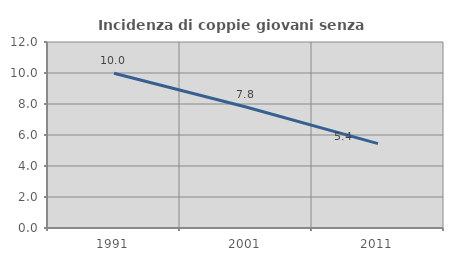
| Category | Incidenza di coppie giovani senza figli |
|---|---|
| 1991.0 | 9.989 |
| 2001.0 | 7.806 |
| 2011.0 | 5.445 |